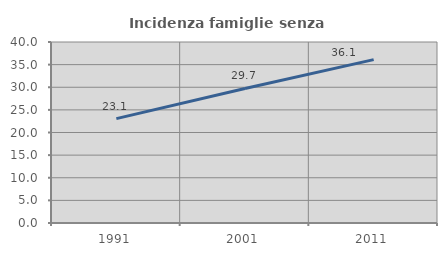
| Category | Incidenza famiglie senza nuclei |
|---|---|
| 1991.0 | 23.059 |
| 2001.0 | 29.741 |
| 2011.0 | 36.106 |